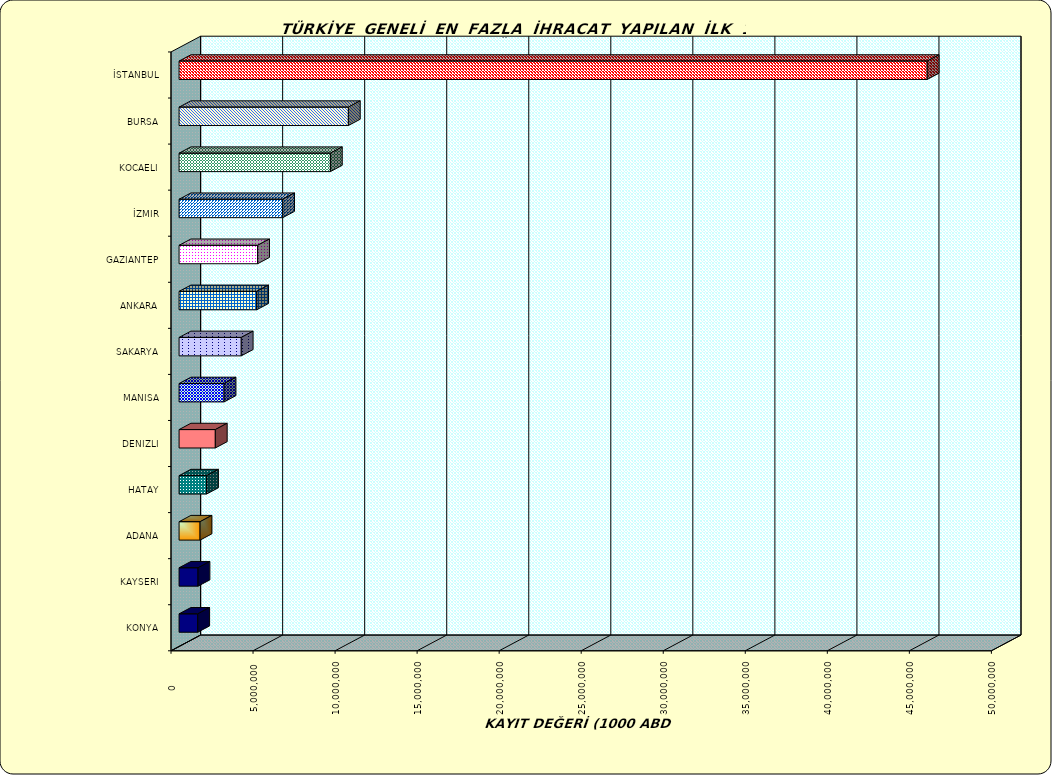
| Category | Series 0 |
|---|---|
| İSTANBUL | 45595601.328 |
| BURSA | 10318955.566 |
| KOCAELI | 9222884.822 |
| İZMIR | 6312985.54 |
| GAZIANTEP | 4787315.763 |
| ANKARA | 4730745.947 |
| SAKARYA | 3789848.163 |
| MANISA | 2743072.926 |
| DENIZLI | 2208377.351 |
| HATAY | 1673456.504 |
| ADANA | 1279478.039 |
| KAYSERI | 1154337.211 |
| KONYA | 1138468.009 |